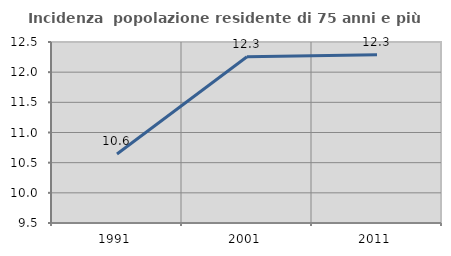
| Category | Incidenza  popolazione residente di 75 anni e più |
|---|---|
| 1991.0 | 10.644 |
| 2001.0 | 12.256 |
| 2011.0 | 12.287 |